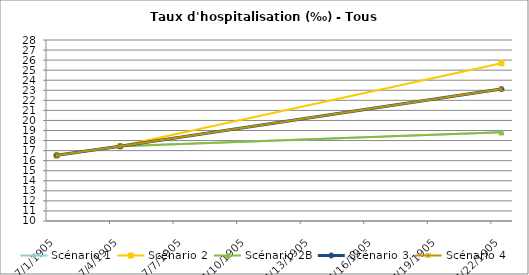
| Category | Scénario 1 | Scénario 2 | Scénario 2B | Scénario 3 | Scénario 4 |
|---|---|---|---|---|---|
| 2009.0 | 16.53 | 16.53 | 16.53 | 16.53 | 16.53 |
| 2012.0 | 17.437 | 17.437 | 17.437 | 17.437 | 17.437 |
| 2030.0 | 18.815 | 25.691 | 18.815 | 23.122 | 23.122 |